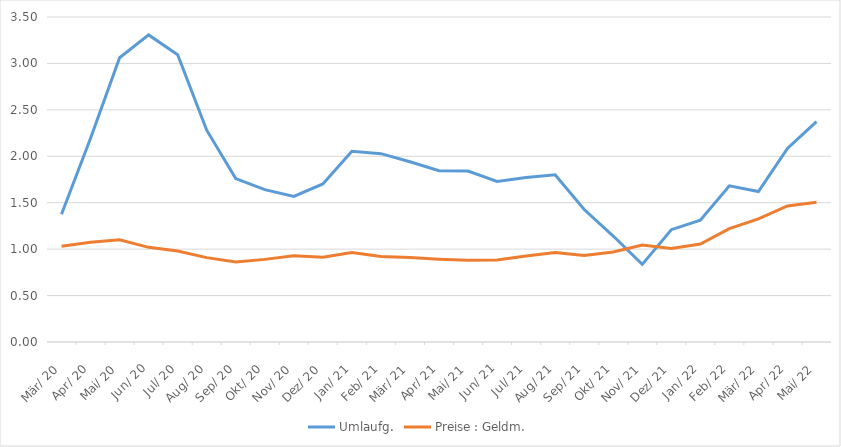
| Category | Umlaufg. | Preise : Geldm. |
|---|---|---|
| 1920-03-05 | 1.375 | 1.031 |
| 1920-04-04 12:00:00 | 2.194 | 1.073 |
| 1920-05-05 | 3.061 | 1.102 |
| 1920-06-04 12:00:00 | 3.307 | 1.019 |
| 1920-07-05 | 3.094 | 0.981 |
| 1920-08-04 12:00:00 | 2.281 | 0.908 |
| 1920-09-04 | 1.759 | 0.861 |
| 1920-10-04 12:00:00 | 1.641 | 0.89 |
| 1920-11-04 | 1.568 | 0.928 |
| 1920-12-04 12:00:00 | 1.703 | 0.912 |
| 1921-01-04 | 2.053 | 0.962 |
| 1921-02-03 12:00:00 | 2.028 | 0.922 |
| 1921-03-06 | 1.941 | 0.91 |
| 1921-04-05 12:00:00 | 1.844 | 0.892 |
| 1921-05-06 | 1.84 | 0.881 |
| 1921-06-05 12:00:00 | 1.728 | 0.884 |
| 1921-07-06 | 1.772 | 0.927 |
| 1921-08-05 12:00:00 | 1.801 | 0.965 |
| 1921-09-05 | 1.427 | 0.93 |
| 1921-10-05 12:00:00 | 1.141 | 0.969 |
| 1921-11-05 | 0.836 | 1.044 |
| 1921-12-05 12:00:00 | 1.21 | 1.008 |
| 1922-01-05 | 1.312 | 1.055 |
| 1922-02-04 12:00:00 | 1.681 | 1.22 |
| 1922-03-07 | 1.62 | 1.326 |
| 1922-04-06 12:00:00 | 2.084 | 1.465 |
| 1922-05-07 | 2.373 | 1.504 |